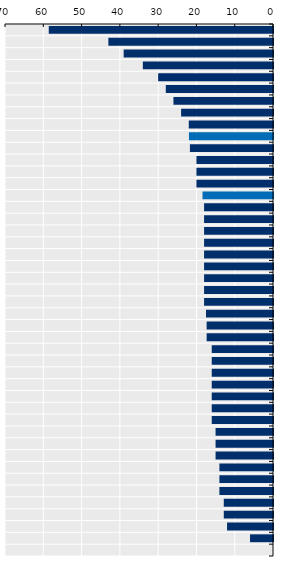
| Category | Length in weeks |
|---|---|
| Bulgaria | 58.571 |
| Greece | 43 |
| United Kingdom | 39 |
| Slovak Republic | 34 |
| Croatia | 30 |
| Czech Republic | 28 |
| Ireland | 26 |
| Hungary | 24 |
| New Zealand | 22 |
| EU average | 21.951 |
| Italy | 21.7 |
| Estonia | 20 |
| Luxembourg | 20 |
| Poland | 20 |
| OECD average | 18.41 |
| Chile | 18 |
| Colombia | 18 |
| Norway | 18 |
| Malta | 18 |
| Romania | 18 |
| Lithuania | 18 |
| Cyprus | 18 |
| Denmark | 18 |
| Australia | 18 |
| Finland | 17.5 |
| Costa Rica | 17.333 |
| Iceland | 17.33 |
| Spain | 16 |
| Austria | 16 |
| Netherlands | 16 |
| France | 16 |
| Latvia | 16 |
| Turkey | 16 |
| Canada | 16 |
| Israel | 15 |
| Slovenia | 15 |
| Belgium | 15 |
| Germany | 14 |
| Japan | 14 |
| Switzerland | 14 |
| Korea | 12.857 |
| Sweden | 12.857 |
| Mexico | 12 |
| Portugal | 6 |
| United States | 0 |